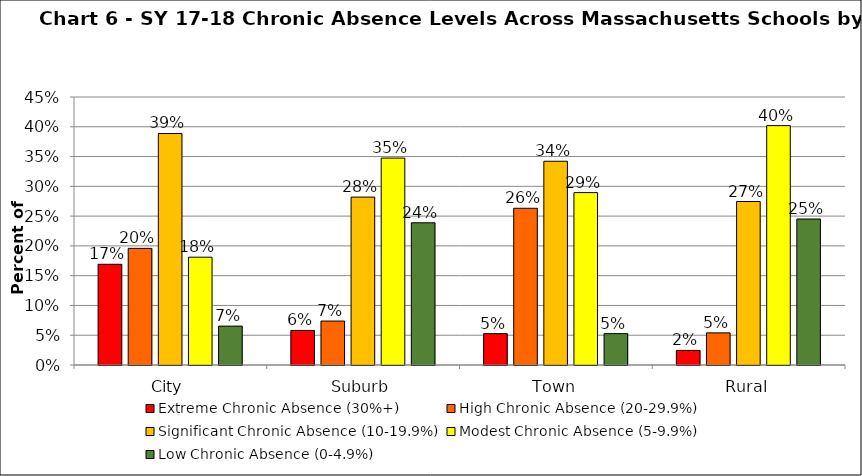
| Category | Extreme Chronic Absence (30%+) | High Chronic Absence (20-29.9%) | Significant Chronic Absence (10-19.9%) | Modest Chronic Absence (5-9.9%) | Low Chronic Absence (0-4.9%) |
|---|---|---|---|---|---|
| 0 | 0.169 | 0.196 | 0.389 | 0.181 | 0.065 |
| 1 | 0.058 | 0.074 | 0.282 | 0.347 | 0.239 |
| 2 | 0.053 | 0.263 | 0.342 | 0.289 | 0.053 |
| 3 | 0.025 | 0.054 | 0.275 | 0.402 | 0.245 |